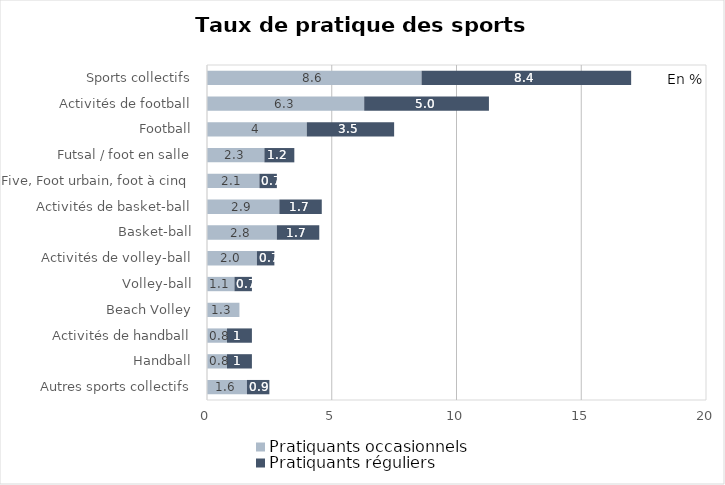
| Category | Pratiquants occasionnels | Pratiquants réguliers |
|---|---|---|
| Autres sports collectifs | 1.6 | 0.9 |
| Handball | 0.8 | 1 |
| Activités de handball | 0.8 | 1 |
| Beach Volley | 1.3 | 0 |
| Volley-ball | 1.1 | 0.7 |
| Activités de volley-ball | 2 | 0.7 |
| Basket-ball | 2.8 | 1.7 |
| Activités de basket-ball | 2.9 | 1.7 |
| Five, Foot urbain, foot à cinq | 2.1 | 0.7 |
| Futsal / foot en salle | 2.3 | 1.2 |
| Football | 4 | 3.5 |
| Activités de football | 6.3 | 5 |
| Sports collectifs | 8.6 | 8.4 |